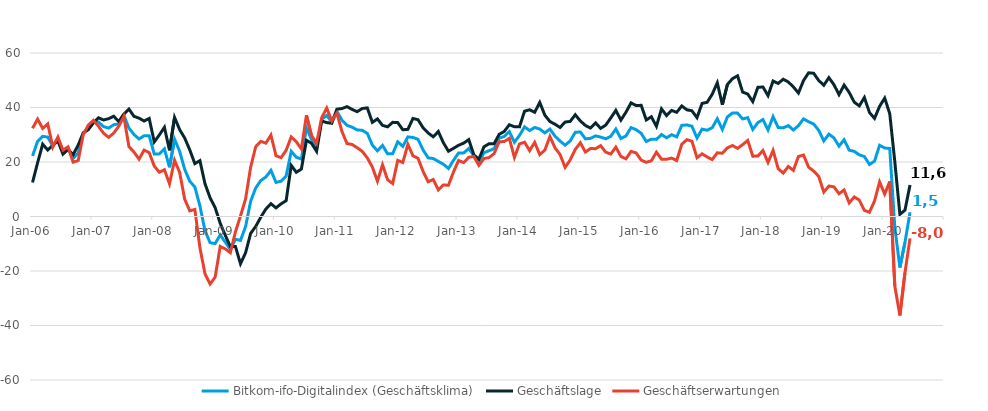
| Category | Bitkom-ifo-Digitalindex (Geschäftsklima) | Geschäftslage | Geschäftserwartungen |
|---|---|---|---|
| 2006-01-01 | 22.21 | 12.497 | 32.367 |
| 2006-02-01 | 27.599 | 19.731 | 35.749 |
| 2006-03-01 | 29.419 | 26.541 | 32.333 |
| 2006-04-01 | 29.13 | 24.395 | 33.965 |
| 2006-05-01 | 25.828 | 26.157 | 25.5 |
| 2006-06-01 | 28.466 | 27.754 | 29.18 |
| 2006-07-01 | 23.611 | 22.889 | 24.335 |
| 2006-08-01 | 25.069 | 24.571 | 25.568 |
| 2006-09-01 | 21.31 | 22.682 | 19.947 |
| 2006-10-01 | 23.341 | 26.206 | 20.511 |
| 2006-11-01 | 30.406 | 30.708 | 30.105 |
| 2006-12-01 | 32.698 | 31.855 | 33.544 |
| 2007-01-01 | 34.816 | 34.35 | 35.283 |
| 2007-02-01 | 34.672 | 36.221 | 33.134 |
| 2007-03-01 | 32.98 | 35.42 | 30.566 |
| 2007-04-01 | 32.444 | 35.897 | 29.041 |
| 2007-05-01 | 33.665 | 36.785 | 30.586 |
| 2007-06-01 | 33.984 | 34.853 | 33.118 |
| 2007-07-01 | 37.151 | 37.596 | 36.706 |
| 2007-08-01 | 32.449 | 39.436 | 25.665 |
| 2007-09-01 | 30.096 | 36.74 | 23.639 |
| 2007-10-01 | 28.446 | 36.096 | 21.043 |
| 2007-11-01 | 29.64 | 35.022 | 24.382 |
| 2007-12-01 | 29.622 | 35.969 | 23.446 |
| 2008-01-01 | 22.897 | 27.385 | 18.498 |
| 2008-02-01 | 22.982 | 29.917 | 16.255 |
| 2008-03-01 | 24.813 | 32.725 | 17.171 |
| 2008-04-01 | 18.055 | 24.281 | 12.002 |
| 2008-05-01 | 28.369 | 36.359 | 20.649 |
| 2008-06-01 | 23.916 | 31.898 | 16.209 |
| 2008-07-01 | 17.272 | 28.778 | 6.344 |
| 2008-08-01 | 12.966 | 24.444 | 2.075 |
| 2008-09-01 | 10.823 | 19.4 | 2.581 |
| 2008-10-01 | 3.884 | 20.499 | -11.479 |
| 2008-11-01 | -5.199 | 12.016 | -21.017 |
| 2008-12-01 | -9.614 | 6.892 | -24.803 |
| 2009-01-01 | -9.928 | 3.263 | -22.262 |
| 2009-02-01 | -6.779 | -2.481 | -10.983 |
| 2009-03-01 | -9.414 | -6.911 | -11.885 |
| 2009-04-01 | -12.152 | -11.014 | -13.283 |
| 2009-05-01 | -8.349 | -10.994 | -5.667 |
| 2009-06-01 | -8.772 | -17.343 | 0.201 |
| 2009-07-01 | -3.697 | -13.323 | 6.425 |
| 2009-08-01 | 5.584 | -6.206 | 18.091 |
| 2009-09-01 | 10.485 | -3.634 | 25.619 |
| 2009-10-01 | 13.199 | -0.252 | 27.555 |
| 2009-11-01 | 14.487 | 2.731 | 26.925 |
| 2009-12-01 | 16.928 | 4.7 | 29.886 |
| 2010-01-01 | 12.517 | 3.163 | 22.302 |
| 2010-02-01 | 12.952 | 4.647 | 21.595 |
| 2010-03-01 | 14.855 | 5.804 | 24.305 |
| 2010-04-01 | 23.917 | 18.761 | 29.195 |
| 2010-05-01 | 21.765 | 16.228 | 27.444 |
| 2010-06-01 | 21.064 | 17.395 | 24.795 |
| 2010-07-01 | 32.51 | 27.967 | 37.143 |
| 2010-08-01 | 28.313 | 26.872 | 29.764 |
| 2010-09-01 | 25.371 | 23.916 | 26.836 |
| 2010-10-01 | 35.634 | 35.052 | 36.217 |
| 2010-11-01 | 37.123 | 34.464 | 39.812 |
| 2010-12-01 | 34.635 | 34.217 | 35.053 |
| 2011-01-01 | 38.662 | 39.37 | 37.955 |
| 2011-02-01 | 35.381 | 39.615 | 31.223 |
| 2011-03-01 | 33.442 | 40.314 | 26.767 |
| 2011-04-01 | 32.778 | 39.306 | 26.429 |
| 2011-05-01 | 31.759 | 38.463 | 25.243 |
| 2011-06-01 | 31.636 | 39.635 | 23.905 |
| 2011-07-01 | 30.506 | 39.851 | 21.525 |
| 2011-08-01 | 26.179 | 34.546 | 18.111 |
| 2011-09-01 | 24.089 | 35.807 | 12.954 |
| 2011-10-01 | 26.091 | 33.439 | 18.975 |
| 2011-11-01 | 22.989 | 32.904 | 13.496 |
| 2011-12-01 | 23.039 | 34.555 | 12.089 |
| 2012-01-01 | 27.416 | 34.455 | 20.588 |
| 2012-02-01 | 25.739 | 31.828 | 19.81 |
| 2012-03-01 | 29.22 | 31.992 | 26.481 |
| 2012-04-01 | 29.015 | 35.979 | 22.257 |
| 2012-05-01 | 28.331 | 35.52 | 21.361 |
| 2012-06-01 | 24.407 | 32.566 | 16.534 |
| 2012-07-01 | 21.515 | 30.646 | 12.745 |
| 2012-08-01 | 21.274 | 29.238 | 13.586 |
| 2012-09-01 | 20.225 | 31.202 | 9.769 |
| 2012-10-01 | 19.173 | 27.053 | 11.567 |
| 2012-11-01 | 17.626 | 23.956 | 11.476 |
| 2012-12-01 | 20.65 | 25.014 | 16.37 |
| 2013-01-01 | 23.337 | 26.142 | 20.568 |
| 2013-02-01 | 23.318 | 26.92 | 19.772 |
| 2013-03-01 | 24.941 | 28.214 | 21.714 |
| 2013-04-01 | 22.329 | 22.612 | 22.046 |
| 2013-05-01 | 19.903 | 21.041 | 18.772 |
| 2013-06-01 | 23.415 | 25.579 | 21.271 |
| 2013-07-01 | 24.142 | 26.691 | 21.621 |
| 2013-08-01 | 24.903 | 26.732 | 23.088 |
| 2013-09-01 | 28.781 | 30.142 | 27.427 |
| 2013-10-01 | 29.356 | 31.215 | 27.511 |
| 2013-11-01 | 31.169 | 33.678 | 28.688 |
| 2013-12-01 | 27.238 | 32.931 | 21.684 |
| 2014-01-01 | 29.739 | 32.893 | 26.627 |
| 2014-02-01 | 32.889 | 38.643 | 27.274 |
| 2014-03-01 | 31.537 | 39.168 | 24.151 |
| 2014-04-01 | 32.667 | 38.246 | 27.22 |
| 2014-05-01 | 32.087 | 41.851 | 22.717 |
| 2014-06-01 | 30.684 | 37.186 | 24.36 |
| 2014-07-01 | 32.09 | 34.858 | 29.354 |
| 2014-08-01 | 29.498 | 33.862 | 25.215 |
| 2014-09-01 | 27.667 | 32.673 | 22.768 |
| 2014-10-01 | 26.189 | 34.667 | 18.017 |
| 2014-11-01 | 27.721 | 34.891 | 20.77 |
| 2014-12-01 | 30.892 | 37.343 | 24.616 |
| 2015-01-01 | 31.037 | 35.073 | 27.07 |
| 2015-02-01 | 28.477 | 33.409 | 23.65 |
| 2015-03-01 | 28.677 | 32.461 | 24.954 |
| 2015-04-01 | 29.572 | 34.366 | 24.876 |
| 2015-05-01 | 29.146 | 32.341 | 25.995 |
| 2015-06-01 | 28.514 | 33.538 | 23.599 |
| 2015-07-01 | 29.446 | 36.158 | 22.925 |
| 2015-08-01 | 32.106 | 38.947 | 25.46 |
| 2015-09-01 | 28.604 | 35.367 | 22.035 |
| 2015-10-01 | 29.572 | 38.291 | 21.172 |
| 2015-11-01 | 32.631 | 41.702 | 23.901 |
| 2015-12-01 | 31.863 | 40.726 | 23.326 |
| 2016-01-01 | 30.524 | 40.798 | 20.688 |
| 2016-02-01 | 27.523 | 35.426 | 19.885 |
| 2016-03-01 | 28.382 | 36.603 | 20.447 |
| 2016-04-01 | 28.295 | 33.095 | 23.593 |
| 2016-05-01 | 30.082 | 39.494 | 21.039 |
| 2016-06-01 | 28.883 | 37.039 | 21.008 |
| 2016-07-01 | 30.013 | 38.925 | 21.434 |
| 2016-08-01 | 29.218 | 38.233 | 20.544 |
| 2016-09-01 | 33.436 | 40.573 | 26.512 |
| 2016-10-01 | 33.612 | 39.158 | 28.195 |
| 2016-11-01 | 33.137 | 38.787 | 27.62 |
| 2016-12-01 | 28.811 | 36.274 | 21.583 |
| 2017-01-01 | 32.065 | 41.5 | 23 |
| 2017-02-01 | 31.662 | 41.905 | 21.853 |
| 2017-03-01 | 32.577 | 44.865 | 20.906 |
| 2017-04-01 | 35.873 | 49.066 | 23.378 |
| 2017-05-01 | 31.945 | 41.014 | 23.218 |
| 2017-06-01 | 36.549 | 48.455 | 25.214 |
| 2017-07-01 | 38 | 50.586 | 26.045 |
| 2017-08-01 | 37.94 | 51.631 | 24.995 |
| 2017-09-01 | 35.819 | 45.655 | 26.376 |
| 2017-10-01 | 36.268 | 44.933 | 27.91 |
| 2017-11-01 | 31.945 | 42.176 | 22.146 |
| 2017-12-01 | 34.454 | 47.408 | 22.178 |
| 2018-01-01 | 35.585 | 47.528 | 24.218 |
| 2018-02-01 | 31.769 | 44.371 | 19.818 |
| 2018-03-01 | 36.651 | 49.733 | 24.254 |
| 2018-04-01 | 32.672 | 48.828 | 17.565 |
| 2018-05-01 | 32.52 | 50.375 | 15.939 |
| 2018-06-01 | 33.355 | 49.376 | 18.363 |
| 2018-07-01 | 31.732 | 47.542 | 16.931 |
| 2018-08-01 | 33.368 | 45.307 | 22.009 |
| 2018-09-01 | 35.823 | 49.878 | 22.559 |
| 2018-10-01 | 34.785 | 52.731 | 18.113 |
| 2018-11-01 | 33.939 | 52.573 | 16.679 |
| 2018-12-01 | 31.635 | 49.917 | 14.689 |
| 2019-01-01 | 27.72 | 48.17 | 8.956 |
| 2019-02-01 | 30.212 | 50.967 | 11.174 |
| 2019-03-01 | 28.852 | 48.359 | 10.877 |
| 2019-04-01 | 25.814 | 44.732 | 8.358 |
| 2019-05-01 | 28.173 | 48.221 | 9.744 |
| 2019-06-01 | 24.355 | 45.546 | 4.992 |
| 2019-07-01 | 23.899 | 41.968 | 7.179 |
| 2019-08-01 | 22.641 | 40.605 | 6.018 |
| 2019-09-01 | 21.995 | 43.662 | 2.254 |
| 2019-10-01 | 19.106 | 38.168 | 1.569 |
| 2019-11-01 | 20.325 | 36 | 5.691 |
| 2019-12-01 | 26.128 | 40.435 | 12.673 |
| 2020-01-01 | 25.138 | 43.432 | 8.219 |
| 2020-02-01 | 24.96 | 37.777 | 12.834 |
| 2020-03-01 | -4.012 | 20.116 | -25.494 |
| 2020-04-01 | -18.7 | 0.801 | -36.307 |
| 2020-05-01 | -9.515 | 2.322 | -20.659 |
| 2020-06-01 | 1.526 | 11.553 | -8.025 |